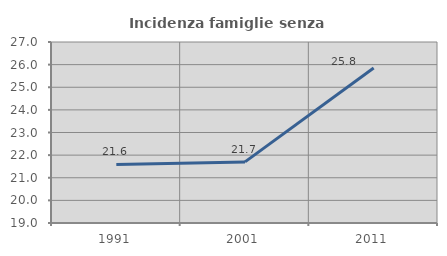
| Category | Incidenza famiglie senza nuclei |
|---|---|
| 1991.0 | 21.59 |
| 2001.0 | 21.701 |
| 2011.0 | 25.847 |